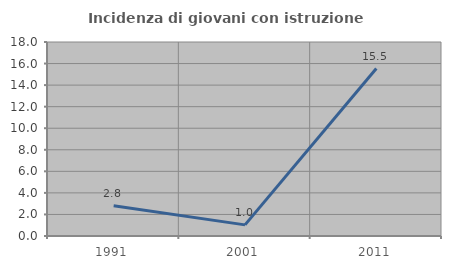
| Category | Incidenza di giovani con istruzione universitaria |
|---|---|
| 1991.0 | 2.804 |
| 2001.0 | 1.031 |
| 2011.0 | 15.534 |